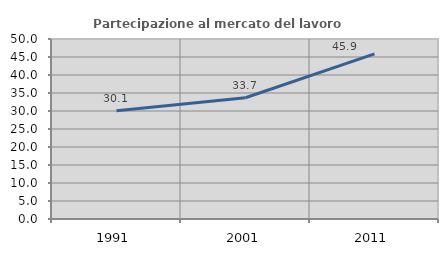
| Category | Partecipazione al mercato del lavoro  femminile |
|---|---|
| 1991.0 | 30.055 |
| 2001.0 | 33.684 |
| 2011.0 | 45.865 |